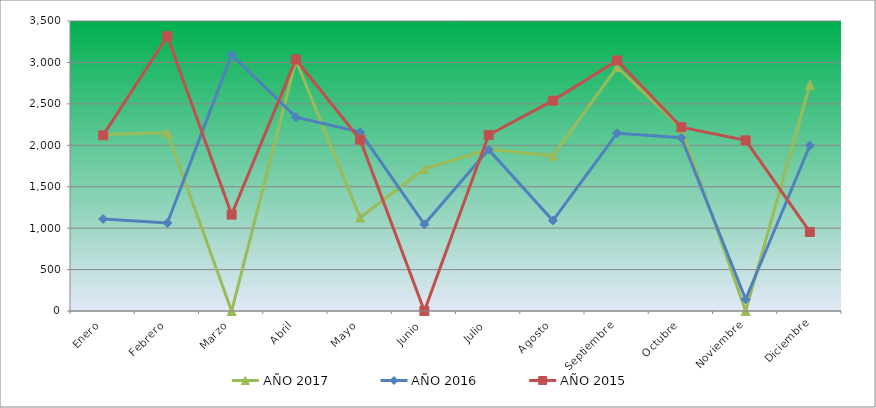
| Category | AÑO 2017 | AÑO 2016 | AÑO 2015 |
|---|---|---|---|
| Enero | 2129.634 | 1110.452 | 2120.195 |
| Febrero | 2149.973 | 1061.937 | 3316.122 |
| Marzo | 0 | 3092.812 | 1163.389 |
| Abril | 3025.764 | 2339.496 | 3035.587 |
| Mayo | 1127.666 | 2158.393 | 2068.549 |
| Junio | 1714.453 | 1045.765 | 0 |
| Julio | 1951.124 | 1947.573 | 2124.749 |
| Agosto | 1872.45 | 1091.585 | 2538.8 |
| Septiembre | 2941.908 | 2145.436 | 3024.221 |
| Octubre | 2207.785 | 2091.531 | 2218.05 |
| Noviembre | 0 | 140.546 | 2059.443 |
| Diciembre | 2729.793 | 1997.196 | 954.088 |